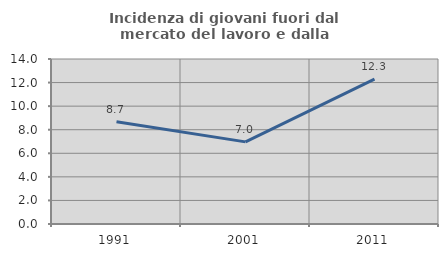
| Category | Incidenza di giovani fuori dal mercato del lavoro e dalla formazione  |
|---|---|
| 1991.0 | 8.683 |
| 2001.0 | 6.969 |
| 2011.0 | 12.295 |